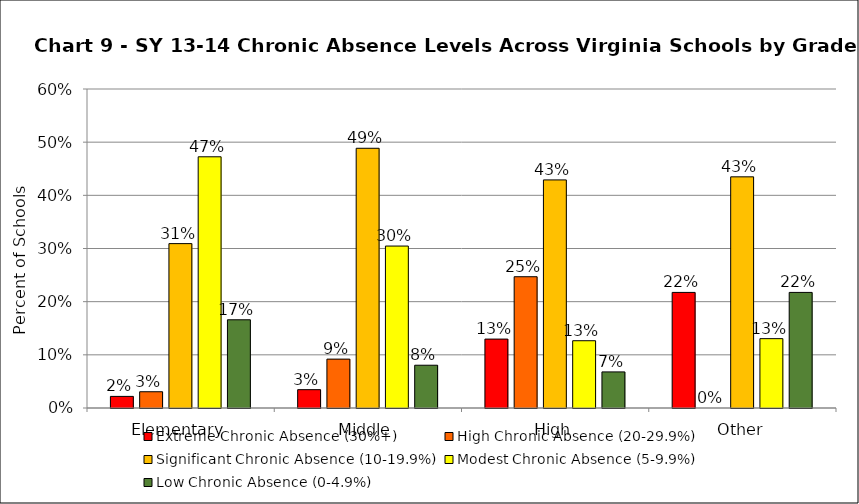
| Category | Extreme Chronic Absence (30%+) | High Chronic Absence (20-29.9%) | Significant Chronic Absence (10-19.9%) | Modest Chronic Absence (5-9.9%) | Low Chronic Absence (0-4.9%) |
|---|---|---|---|---|---|
| 0 | 0.022 | 0.031 | 0.309 | 0.472 | 0.166 |
| 1 | 0.034 | 0.092 | 0.489 | 0.305 | 0.08 |
| 2 | 0.13 | 0.247 | 0.429 | 0.127 | 0.068 |
| 3 | 0.217 | 0 | 0.435 | 0.13 | 0.217 |